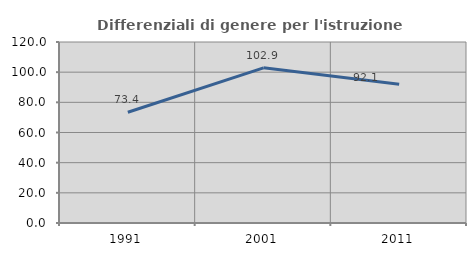
| Category | Differenziali di genere per l'istruzione superiore |
|---|---|
| 1991.0 | 73.425 |
| 2001.0 | 102.88 |
| 2011.0 | 92.062 |